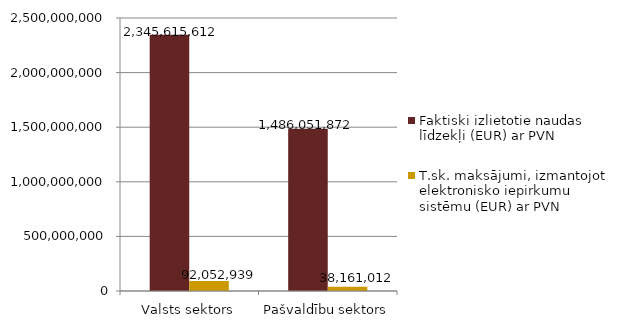
| Category | Faktiski izlietotie naudas līdzekļi (EUR) ar PVN | T.sk. maksājumi, izmantojot elektronisko iepirkumu sistēmu (EUR) ar PVN |
|---|---|---|
| Valsts sektors | 2345615612 | 92052939 |
| Pašvaldību sektors | 1486051872 | 38161012 |